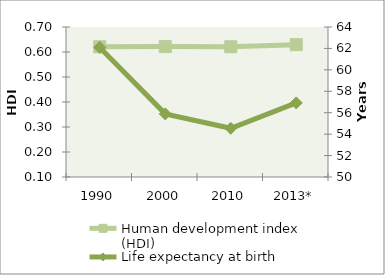
| Category | Human development index (HDI) |
|---|---|
| 1990 | 0.621 |
| 2000 | 0.622 |
| 2010 | 0.621 |
| 2013* | 0.629 |